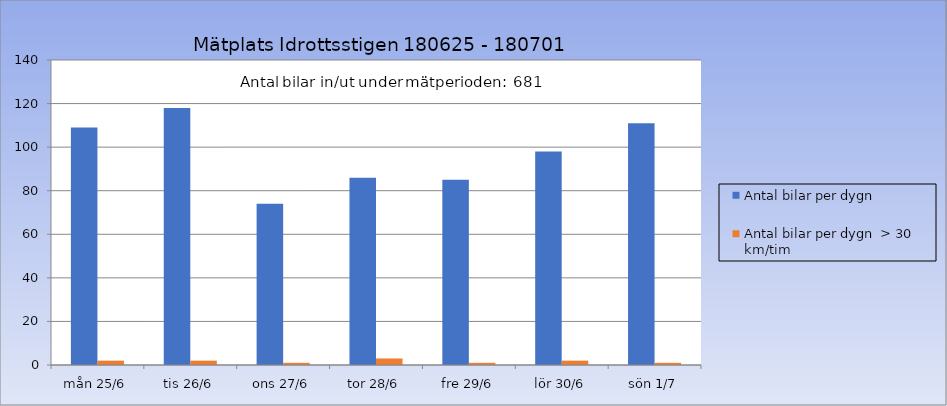
| Category | Antal bilar per dygn | Antal bilar per dygn  > 30 km/tim |
|---|---|---|
| mån 25/6 | 109 | 2 |
| tis 26/6 | 118 | 2 |
| ons 27/6 | 74 | 1 |
| tor 28/6 | 86 | 3 |
| fre 29/6 | 85 | 1 |
| lör 30/6 | 98 | 2 |
| sön 1/7 | 111 | 1 |